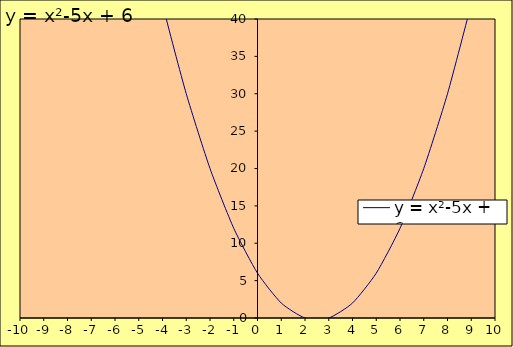
| Category | y = x²-5x + 6 |
|---|---|
| -8.0 | 110 |
| -7.0 | 90 |
| -6.0 | 72 |
| -5.0 | 56 |
| -4.0 | 42 |
| -3.0 | 30 |
| -2.0 | 20 |
| -1.0 | 12 |
| 0.0 | 6 |
| 1.0 | 2 |
| 2.0 | 0 |
| 3.0 | 0 |
| 4.0 | 2 |
| 5.0 | 6 |
| 6.0 | 12 |
| 7.0 | 20 |
| 8.0 | 30 |
| 9.0 | 42 |